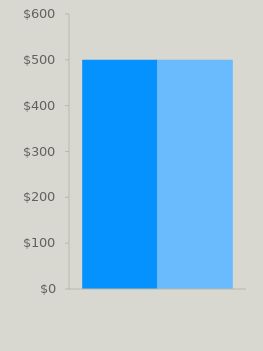
| Category | Income | Expenses |
|---|---|---|
| 0 | 500 | 500 |